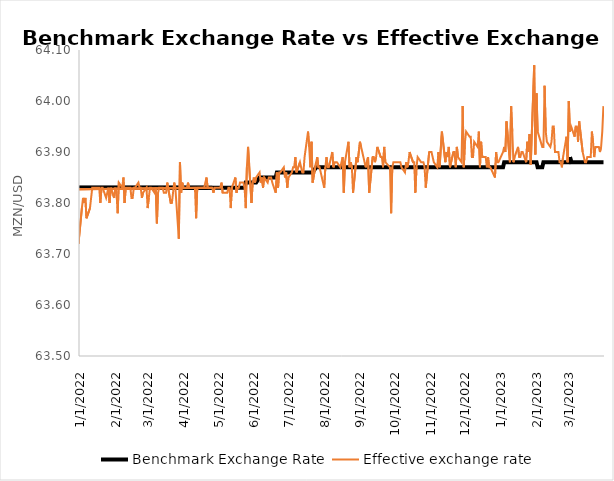
| Category | Benchmark Exchange Rate | Effective exchange rate |
|---|---|---|
| 12/14/21 | 63.83 | 63.76 |
| 12/15/21 | 63.83 | 63.82 |
| 12/16/21 | 63.83 | 63.8 |
| 12/17/21 | 63.83 | 63.79 |
| 12/20/21 | 63.83 | 63.84 |
| 12/21/21 | 63.83 | 63.79 |
| 12/22/21 | 63.83 | 63.8 |
| 12/23/21 | 63.83 | 63.82 |
| 12/27/21 | 63.83 | 63.77 |
| 12/28/21 | 63.83 | 63.74 |
| 12/29/21 | 63.83 | 63.76 |
| 12/30/21 | 63.83 | 63.78 |
| 12/31/21 | 63.83 | 63.72 |
| 1/3/22 | 63.83 | 63.79 |
| 1/4/22 | 63.83 | 63.81 |
| 1/5/22 | 63.83 | 63.8 |
| 1/6/22 | 63.83 | 63.81 |
| 1/7/22 | 63.83 | 63.77 |
| 1/10/22 | 63.83 | 63.79 |
| 1/12/22 | 63.83 | 63.83 |
| 1/13/22 | 63.83 | 63.83 |
| 1/14/22 | 63.83 | 63.83 |
| 1/17/22 | 63.83 | 63.83 |
| 1/18/22 | 63.83 | 63.83 |
| 1/19/22 | 63.83 | 63.8 |
| 1/20/22 | 63.83 | 63.83 |
| 1/21/22 | 63.83 | 63.83 |
| 1/24/22 | 63.83 | 63.81 |
| 1/25/22 | 63.83 | 63.82 |
| 1/26/22 | 63.83 | 63.83 |
| 1/27/22 | 63.83 | 63.8 |
| 1/28/22 | 63.83 | 63.83 |
| 1/31/22 | 63.83 | 63.81 |
| 2/1/22 | 63.83 | 63.83 |
| 2/2/22 | 63.83 | 63.82 |
| 2/3/22 | 63.83 | 63.78 |
| 2/4/22 | 63.83 | 63.84 |
| 2/7/22 | 63.83 | 63.83 |
| 2/8/22 | 63.83 | 63.85 |
| 2/9/22 | 63.83 | 63.8 |
| 2/10/22 | 63.83 | 63.83 |
| 2/11/22 | 63.83 | 63.83 |
| 2/14/22 | 63.83 | 63.83 |
| 2/15/22 | 63.83 | 63.81 |
| 2/16/22 | 63.83 | 63.81 |
| 2/17/22 | 63.83 | 63.83 |
| 2/18/22 | 63.83 | 63.83 |
| 2/21/22 | 63.83 | 63.84 |
| 2/22/22 | 63.83 | 63.83 |
| 2/23/22 | 63.83 | 63.83 |
| 2/24/22 | 63.83 | 63.81 |
| 2/25/22 | 63.83 | 63.82 |
| 2/28/22 | 63.83 | 63.83 |
| 3/1/22 | 63.83 | 63.79 |
| 3/2/22 | 63.83 | 63.81 |
| 3/3/22 | 63.83 | 63.83 |
| 3/4/22 | 63.83 | 63.83 |
| 3/7/22 | 63.83 | 63.82 |
| 3/8/22 | 63.83 | 63.83 |
| 3/9/22 | 63.83 | 63.76 |
| 3/10/22 | 63.83 | 63.82 |
| 3/11/22 | 63.83 | 63.83 |
| 3/14/22 | 63.83 | 63.83 |
| 3/15/22 | 63.83 | 63.82 |
| 3/16/22 | 63.83 | 63.82 |
| 3/17/22 | 63.83 | 63.82 |
| 3/18/22 | 63.83 | 63.84 |
| 3/21/22 | 63.83 | 63.8 |
| 3/22/22 | 63.83 | 63.8 |
| 3/23/22 | 63.83 | 63.82 |
| 3/24/22 | 63.83 | 63.84 |
| 3/25/22 | 63.83 | 63.83 |
| 3/28/22 | 63.83 | 63.73 |
| 3/29/22 | 63.83 | 63.88 |
| 3/30/22 | 63.83 | 63.82 |
| 3/31/22 | 63.83 | 63.84 |
| 4/1/22 | 63.83 | 63.83 |
| 4/4/22 | 63.83 | 63.83 |
| 4/5/22 | 63.83 | 63.84 |
| 4/6/22 | 63.83 | 63.83 |
| 4/8/22 | 63.83 | 63.83 |
| 4/11/22 | 63.83 | 63.83 |
| 4/12/22 | 63.83 | 63.77 |
| 4/13/22 | 63.83 | 63.83 |
| 4/14/22 | 63.83 | 63.83 |
| 4/18/22 | 63.83 | 63.83 |
| 4/19/22 | 63.83 | 63.83 |
| 4/20/22 | 63.83 | 63.84 |
| 4/21/22 | 63.83 | 63.85 |
| 4/22/22 | 63.83 | 63.83 |
| 4/25/20 | 63.83 | 63.81 |
| 4/26/22 | 63.83 | 63.83 |
| 4/27/22 | 63.83 | 63.82 |
| 4/28/22 | 63.83 | 63.83 |
| 4/29/22 | 63.83 | 63.83 |
| 5/3/22 | 63.83 | 63.83 |
| 5/4/22 | 63.83 | 63.84 |
| 5/5/22 | 63.83 | 63.82 |
| 5/6/22 | 63.83 | 63.82 |
| 5/9/22 | 63.83 | 63.82 |
| 5/10/22 | 63.83 | 63.83 |
| 5/11/22 | 63.83 | 63.83 |
| 5/12/22 | 63.83 | 63.79 |
| 5/13/22 | 63.83 | 63.83 |
| 5/16/22 | 63.83 | 63.85 |
| 5/17/22 | 63.83 | 63.82 |
| 5/18/22 | 63.83 | 63.83 |
| 5/19/22 | 63.83 | 63.83 |
| 5/20/22 | 63.83 | 63.84 |
| 5/23/22 | 63.83 | 63.84 |
| 5/24/22 | 63.83 | 63.83 |
| 5/25/22 | 63.84 | 63.79 |
| 5/26/22 | 63.84 | 63.87 |
| 5/27/22 | 63.84 | 63.91 |
| 5/30/22 | 63.84 | 63.8 |
| 5/31/22 | 63.84 | 63.84 |
| 6/1/22 | 63.84 | 63.85 |
| 6/2/22 | 63.84 | 63.84 |
| 6/3/22 | 63.84 | 63.85 |
| 6/6/22 | 63.85 | 63.86 |
| 6/7/22 | 63.85 | 63.84 |
| 6/8/22 | 63.85 | 63.85 |
| 6/9/22 | 63.85 | 63.83 |
| 6/10/22 | 63.85 | 63.85 |
| 6/13/22 | 63.85 | 63.84 |
| 6/14/22 | 63.85 | 63.85 |
| 6/15/22 | 63.85 | 63.85 |
| 6/16/22 | 63.85 | 63.85 |
| 6/17/22 | 63.85 | 63.84 |
| 6/20/22 | 63.85 | 63.82 |
| 6/21/22 | 63.86 | 63.86 |
| 6/22/22 | 63.86 | 63.83 |
| 6/23/22 | 63.86 | 63.86 |
| 6/24/22 | 63.86 | 63.86 |
| 6/27/22 | 63.86 | 63.87 |
| 6/28/22 | 63.86 | 63.85 |
| 6/29/22 | 63.86 | 63.86 |
| 6/30/22 | 63.86 | 63.83 |
| 7/1/22 | 63.86 | 63.85 |
| 7/4/22 | 63.86 | 63.86 |
| 7/5/22 | 63.86 | 63.87 |
| 7/6/22 | 63.86 | 63.87 |
| 7/7/22 | 63.86 | 63.89 |
| 7/8/22 | 63.86 | 63.86 |
| 7/11/22 | 63.86 | 63.88 |
| 7/12/22 | 63.86 | 63.87 |
| 7/13/22 | 63.86 | 63.86 |
| 7/14/22 | 63.86 | 63.86 |
| 7/15/22 | 63.86 | 63.89 |
| 7/18/22 | 63.86 | 63.94 |
| 7/19/22 | 63.86 | 63.91 |
| 7/20/22 | 63.86 | 63.87 |
| 7/21/22 | 63.86 | 63.92 |
| 7/22/22 | 63.86 | 63.84 |
| 7/25/22 | 63.87 | 63.88 |
| 7/26/22 | 63.87 | 63.89 |
| 7/27/22 | 63.87 | 63.87 |
| 7/28/22 | 63.87 | 63.87 |
| 7/29/22 | 63.87 | 63.86 |
| 8/1/22 | 63.87 | 63.83 |
| 8/2/22 | 63.87 | 63.87 |
| 8/3/22 | 63.87 | 63.89 |
| 8/4/22 | 63.87 | 63.87 |
| 8/5/22 | 63.87 | 63.87 |
| 8/8/22 | 63.87 | 63.9 |
| 8/9/22 | 63.87 | 63.87 |
| 8/10/22 | 63.87 | 63.88 |
| 8/11/22 | 63.87 | 63.88 |
| 8/12/22 | 63.87 | 63.88 |
| 8/15/22 | 63.87 | 63.87 |
| 8/16/22 | 63.87 | 63.88 |
| 8/17/22 | 63.87 | 63.89 |
| 8/18/22 | 63.87 | 63.82 |
| 8/19/22 | 63.87 | 63.88 |
| 8/22/22 | 63.87 | 63.92 |
| 8/23/22 | 63.87 | 63.87 |
| 8/24/22 | 63.87 | 63.88 |
| 8/25/22 | 63.87 | 63.87 |
| 8/26/22 | 63.87 | 63.82 |
| 8/29/22 | 63.87 | 63.89 |
| 8/30/22 | 63.87 | 63.88 |
| 9/1/22 | 63.87 | 63.92 |
| 9/2/22 | 63.87 | 63.91 |
| 9/5/22 | 63.87 | 63.88 |
| 9/6/22 | 63.87 | 63.87 |
| 9/8/22 | 63.87 | 63.89 |
| 9/9/22 | 63.87 | 63.82 |
| 9/12/22 | 63.87 | 63.89 |
| 9/13/22 | 63.87 | 63.89 |
| 9/14/22 | 63.87 | 63.88 |
| 9/15/22 | 63.87 | 63.89 |
| 9/16/22 | 63.87 | 63.91 |
| 9/19/22 | 63.87 | 63.89 |
| 9/20/22 | 63.87 | 63.89 |
| 9/21/22 | 63.87 | 63.87 |
| 9/22/22 | 63.87 | 63.91 |
| 9/23/22 | 63.87 | 63.88 |
| 9/27/22 | 63.87 | 63.87 |
| 9/28/22 | 63.87 | 63.78 |
| 9/29/22 | 63.87 | 63.87 |
| 9/30/22 | 63.87 | 63.88 |
| 10/3/22 | 63.87 | 63.88 |
| 10/5/22 | 63.87 | 63.88 |
| 10/6/22 | 63.87 | 63.88 |
| 10/7/22 | 63.87 | 63.87 |
| 10/10/22 | 63.87 | 63.86 |
| 10/11/22 | 63.87 | 63.88 |
| 10/12/22 | 63.87 | 63.87 |
| 10/13/22 | 63.87 | 63.88 |
| 10/14/22 | 63.87 | 63.9 |
| 10/17/22 | 63.87 | 63.88 |
| 10/18/22 | 63.87 | 63.88 |
| 10/19/22 | 63.87 | 63.82 |
| 10/20/22 | 63.87 | 63.87 |
| 10/21/22 | 63.87 | 63.89 |
| 10/24/22 | 63.87 | 63.88 |
| 10/25/22 | 63.87 | 63.88 |
| 10/26/22 | 63.87 | 63.88 |
| 10/27/22 | 63.87 | 63.87 |
| 10/28/22 | 63.87 | 63.83 |
| 10/31/22 | 63.87 | 63.9 |
| 11/1/22 | 63.87 | 63.9 |
| 11/2/22 | 63.87 | 63.9 |
| 11/3/22 | 63.87 | 63.89 |
| 11/4/22 | 63.87 | 63.88 |
| 11/7/22 | 63.87 | 63.87 |
| 11/8/22 | 63.87 | 63.9 |
| 11/9/22 | 63.87 | 63.87 |
| 11/11/22 | 63.87 | 63.94 |
| 11/14/22 | 63.87 | 63.88 |
| 11/15/22 | 63.87 | 63.9 |
| 11/16/22 | 63.87 | 63.89 |
| 11/17/22 | 63.87 | 63.91 |
| 11/18/22 | 63.87 | 63.87 |
| 11/21/22 | 63.87 | 63.9 |
| 11/22/22 | 63.87 | 63.9 |
| 11/23/22 | 63.87 | 63.87 |
| 11/24/22 | 63.87 | 63.91 |
| 11/25/22 | 63.87 | 63.89 |
| 11/28/22 | 63.87 | 63.88 |
| 11/29/22 | 63.87 | 63.99 |
| 11/30/22 | 63.87 | 63.87 |
| 12/1/22 | 63.87 | 63.92 |
| 12/2/22 | 63.87 | 63.94 |
| 12/5/22 | 63.87 | 63.93 |
| 12/6/22 | 63.87 | 63.93 |
| 12/7/22 | 63.87 | 63.89 |
| 12/8/22 | 63.87 | 63.89 |
| 12/9/22 | 63.87 | 63.92 |
| 12/12/22 | 63.87 | 63.91 |
| 12/13/22 | 63.87 | 63.94 |
| 12/14/22 | 63.87 | 63.87 |
| 12/15/22 | 63.87 | 63.92 |
| 12/16/22 | 63.87 | 63.89 |
| 12/19/22 | 63.87 | 63.89 |
| 12/20/22 | 63.87 | 63.87 |
| 12/21/22 | 63.87 | 63.89 |
| 12/22/22 | 63.87 | 63.87 |
| 12/23/22 | 63.87 | 63.87 |
| 12/27/22 | 63.87 | 63.85 |
| 12/28/22 | 63.87 | 63.9 |
| 12/29/22 | 63.87 | 63.88 |
| 12/30/22 | 63.87 | 63.88 |
| 1/3/23 | 63.87 | 63.9 |
| 1/4/23 | 63.88 | 63.91 |
| 1/5/23 | 63.88 | 63.9 |
| 1/6/23 | 63.88 | 63.96 |
| 1/9/23 | 63.88 | 63.88 |
| 1/10/23 | 63.88 | 63.99 |
| 1/11/23 | 63.88 | 63.94 |
| 1/12/23 | 63.88 | 63.88 |
| 1/13/23 | 63.88 | 63.89 |
| 1/16/23 | 63.88 | 63.91 |
| 1/17/23 | 63.88 | 63.89 |
| 1/18/23 | 63.88 | 63.89 |
| 1/19/23 | 63.88 | 63.9 |
| 1/20/23 | 63.88 | 63.9 |
| 1/23/23 | 63.88 | 63.88 |
| 1/24/23 | 63.88 | 63.92 |
| 1/25/23 | 63.88 | 63.9 |
| 1/26/23 | 63.88 | 63.935 |
| 1/27/23 | 63.88 | 63.875 |
| 1/30/23 | 63.88 | 64.07 |
| 1/31/23 | 63.88 | 63.895 |
| 2/1/23 | 63.88 | 64.015 |
| 2/2/23 | 63.87 | 63.94 |
| 2/6/23 | 63.87 | 63.91 |
| 2/7/23 | 63.88 | 63.91 |
| 2/8/23 | 63.88 | 64.03 |
| 2/9/23 | 63.88 | 63.94 |
| 2/10/23 | 63.88 | 63.92 |
| 2/13/23 | 63.88 | 63.91 |
| 2/14/23 | 63.88 | 63.92 |
| 2/15/23 | 63.88 | 63.95 |
| 2/16/23 | 63.88 | 63.95 |
| 2/17/23 | 63.88 | 63.9 |
| 2/20/23 | 63.88 | 63.9 |
| 2/21/23 | 63.88 | 63.88 |
| 2/22/23 | 63.88 | 63.88 |
| 2/23/23 | 63.88 | 63.87 |
| 2/24/23 | 63.88 | 63.89 |
| 2/27/23 | 63.88 | 63.93 |
| 2/28/23 | 63.88 | 63.88 |
| 3/1/23 | 63.88 | 64 |
| 3/2/23 | 63.89 | 63.94 |
| 3/3/23 | 63.88 | 63.95 |
| 3/6/23 | 63.88 | 63.93 |
| 3/7/23 | 63.88 | 63.95 |
| 3/8/23 | 63.88 | 63.95 |
| 3/9/23 | 63.88 | 63.92 |
| 3/10/23 | 63.88 | 63.96 |
| 3/13/23 | 63.88 | 63.9 |
| 3/14/23 | 63.88 | 63.89 |
| 3/15/23 | 63.88 | 63.88 |
| 3/16/23 | 63.88 | 63.88 |
| 3/17/23 | 63.88 | 63.89 |
| 3/20/23 | 63.88 | 63.89 |
| 3/21/23 | 63.88 | 63.94 |
| 3/22/23 | 63.88 | 63.92 |
| 3/23/23 | 63.88 | 63.89 |
| 3/24/23 | 63.88 | 63.91 |
| 3/27/23 | 63.88 | 63.91 |
| 3/28/23 | 63.88 | 63.9 |
| 3/29/23 | 63.88 | 63.91 |
| 3/30/23 | 63.88 | 63.94 |
| 3/31/23 | 63.88 | 63.99 |